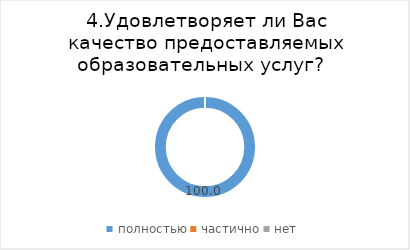
| Category | Series 0 |
|---|---|
| полностью | 100 |
| частично | 0 |
| нет | 0 |